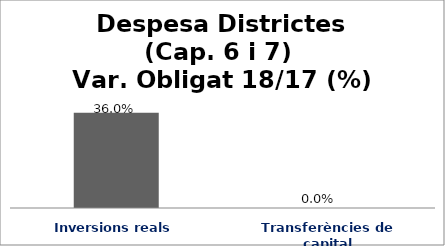
| Category | Series 0 |
|---|---|
| Inversions reals | 0.36 |
| Transferències de capital | 0 |